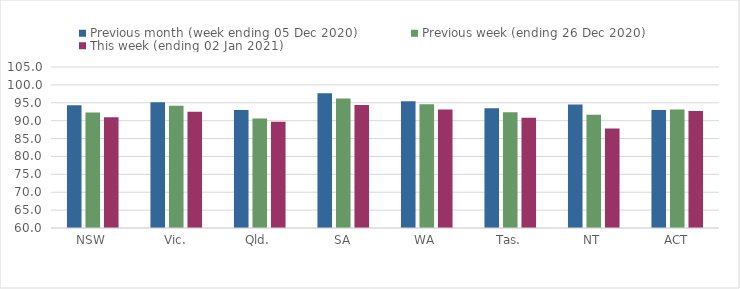
| Category | Previous month (week ending 05 Dec 2020) | Previous week (ending 26 Dec 2020) | This week (ending 02 Jan 2021) |
|---|---|---|---|
| NSW | 94.28 | 92.29 | 90.96 |
| Vic. | 95.13 | 94.18 | 92.48 |
| Qld. | 92.97 | 90.59 | 89.71 |
| SA | 97.64 | 96.19 | 94.37 |
| WA | 95.45 | 94.57 | 93.11 |
| Tas. | 93.46 | 92.32 | 90.84 |
| NT | 94.52 | 91.64 | 87.78 |
| ACT | 92.99 | 93.09 | 92.68 |